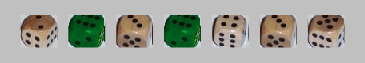
| Category | 1 | 2 | 3 | 4 | 5 | 6 |
|---|---|---|---|---|---|---|
| 2.0 | -1 | 1 | 0 | 0 | 0 | 0 |
| 6.0 | -1 | 0 | 0 | 0 | 0 | 1 |
| 3.0 | -1 | 0 | 1 | 0 | 0 | 0 |
| 6.0 | -1 | 0 | 0 | 0 | 0 | 1 |
| 4.0 | -1 | 0 | 0 | 1 | 0 | 0 |
| 3.0 | -1 | 0 | 1 | 0 | 0 | 0 |
| 5.0 | -1 | 0 | 0 | 0 | 1 | 0 |